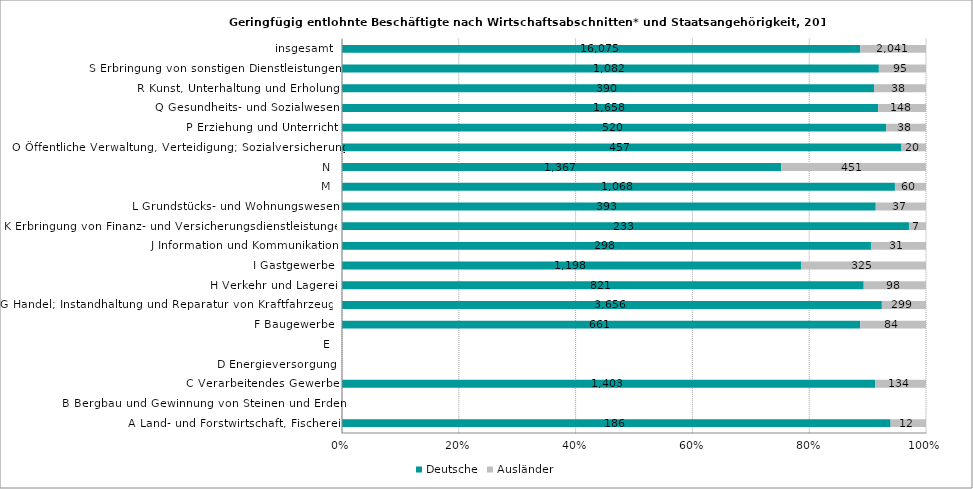
| Category | Deutsche | Ausländer |
|---|---|---|
| A Land- und Forstwirtschaft, Fischerei | 186 | 12 |
| B Bergbau und Gewinnung von Steinen und Erden | 0 | 0 |
| C Verarbeitendes Gewerbe | 1403 | 134 |
| D Energieversorgung | 0 | 0 |
| E | 0 | 0 |
| F Baugewerbe | 661 | 84 |
| G Handel; Instandhaltung und Reparatur von Kraftfahrzeugen | 3656 | 299 |
| H Verkehr und Lagerei | 821 | 98 |
| I Gastgewerbe | 1198 | 325 |
| J Information und Kommunikation | 298 | 31 |
| K Erbringung von Finanz- und Versicherungsdienstleistungen | 233 | 7 |
| L Grundstücks- und Wohnungswesen | 393 | 37 |
| M | 1068 | 60 |
| N | 1367 | 451 |
| O Öffentliche Verwaltung, Verteidigung; Sozialversicherung | 457 | 20 |
| P Erziehung und Unterricht | 520 | 38 |
| Q Gesundheits- und Sozialwesen | 1658 | 148 |
| R Kunst, Unterhaltung und Erholung | 390 | 38 |
| S Erbringung von sonstigen Dienstleistungen | 1082 | 95 |
| insgesamt | 16075 | 2041 |